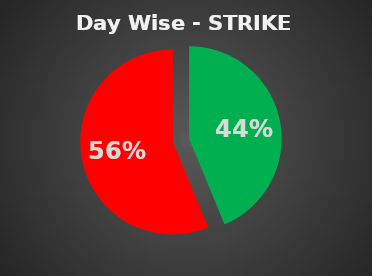
| Category | Series 0 |
|---|---|
| 0 | 0.438 |
| 1 | 0.562 |